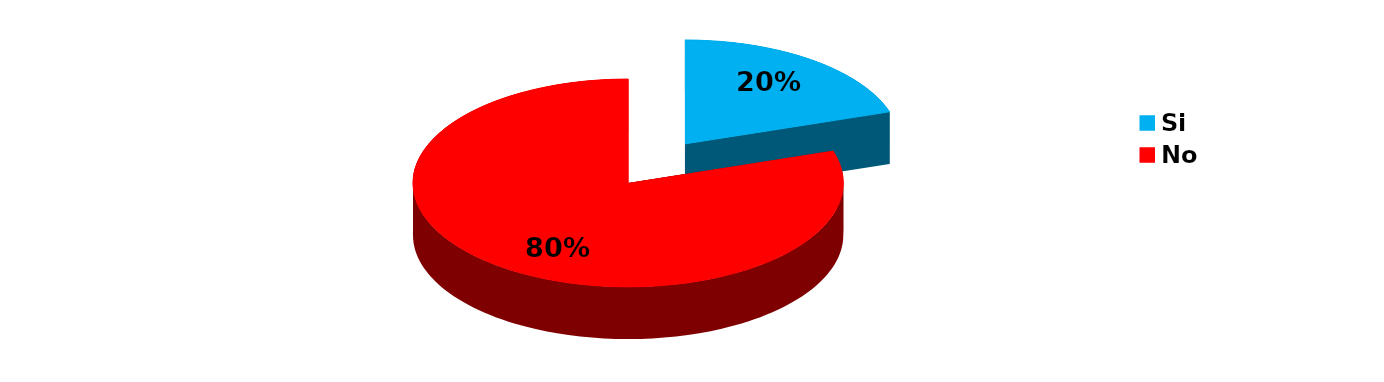
| Category | Series 0 |
|---|---|
| Si | 5 |
| No | 20 |